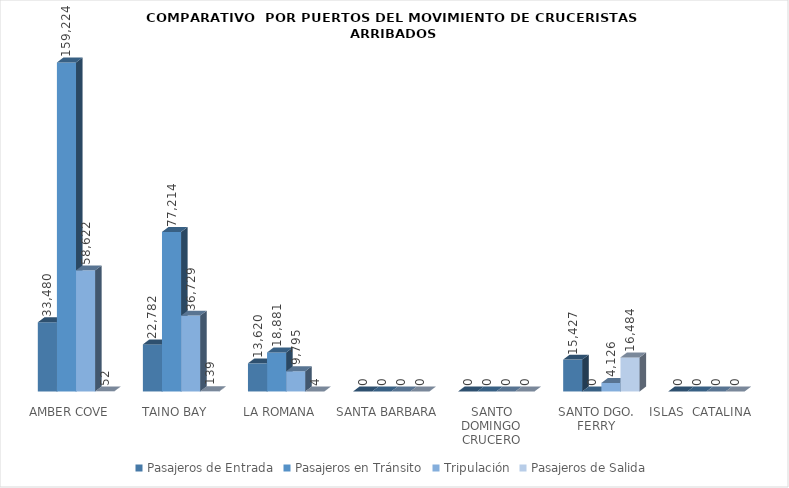
| Category | Pasajeros de Entrada | Pasajeros en Tránsito | Tripulación | Pasajeros de Salida |
|---|---|---|---|---|
| AMBER COVE | 33480 | 159224 | 58622 | 52 |
| TAINO BAY | 22782 | 77214 | 36729 | 139 |
| LA ROMANA | 13620 | 18881 | 9795 | 4 |
| SANTA BARBARA  | 0 | 0 | 0 | 0 |
| SANTO DOMINGO CRUCERO | 0 | 0 | 0 | 0 |
| SANTO DGO. FERRY | 15427 | 0 | 4126 | 16484 |
| ISLAS  CATALINA  | 0 | 0 | 0 | 0 |